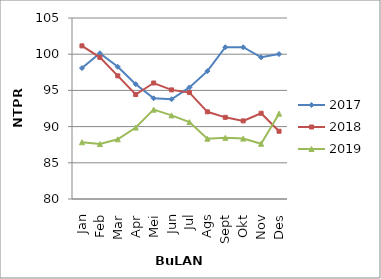
| Category | 2017 | 2018 | 2019 |
|---|---|---|---|
| Jan | 98.08 | 101.15 | 87.84 |
| Feb | 100.13 | 99.56 | 87.59 |
| Mar | 98.26 | 97.01 | 88.25 |
| Apr | 95.86 | 94.43 | 89.87 |
| Mei | 93.91 | 96.02 | 92.34 |
| Jun | 93.78 | 95.07 | 91.55 |
| Jul | 95.41 | 94.7 | 90.62 |
| Ags | 97.66 | 92.04 | 88.33 |
| Sept | 100.96 | 91.28 | 88.45 |
| Okt | 100.96 | 90.79 | 88.34 |
| Nov | 99.57 | 91.84 | 87.63 |
| Des | 100.02 | 89.36 | 91.79 |